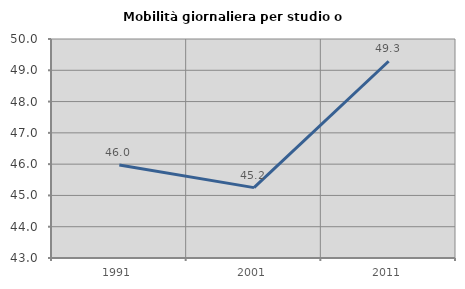
| Category | Mobilità giornaliera per studio o lavoro |
|---|---|
| 1991.0 | 45.973 |
| 2001.0 | 45.249 |
| 2011.0 | 49.288 |